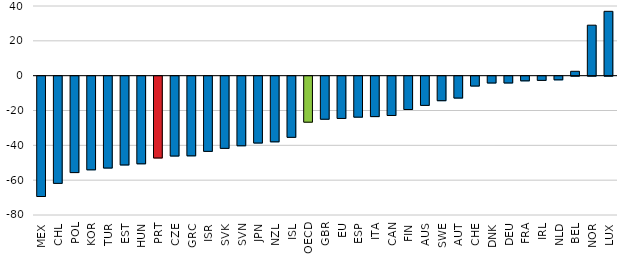
| Category | Labour productivity |
|---|---|
| MEX | -69.092 |
| CHL | -61.547 |
| POL | -55.374 |
| KOR | -53.784 |
| TUR | -52.753 |
| EST | -50.97 |
| HUN | -50.332 |
| PRT | -46.972 |
| CZE | -45.854 |
| GRC | -45.747 |
| ISR | -43.176 |
| SVK | -41.446 |
| SVN | -39.968 |
| JPN | -38.389 |
| NZL | -37.699 |
| ISL | -35.117 |
| OECD | -26.421 |
| GBR | -24.722 |
| EU | -24.271 |
| ESP | -23.532 |
| ITA | -23.216 |
| CAN | -22.577 |
| FIN | -19.143 |
| AUS | -16.773 |
| SWE | -14.084 |
| AUT | -12.564 |
| CHE | -5.668 |
| DNK | -3.916 |
| DEU | -3.909 |
| FRA | -2.681 |
| IRL | -2.419 |
| NLD | -2.107 |
| BEL | 2.516 |
| NOR | 28.989 |
| LUX | 36.944 |